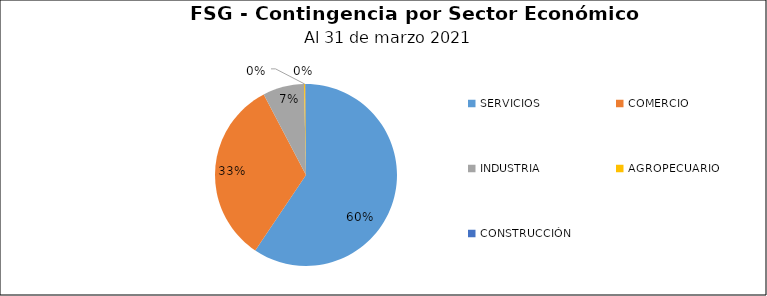
| Category | Saldo | Créditos |
|---|---|---|
| SERVICIOS | 60.328 | 8251 |
| COMERCIO | 33.409 | 10050 |
| INDUSTRIA | 7.45 | 2225 |
| AGROPECUARIO | 0.254 | 36 |
| CONSTRUCCIÓN | 0.099 | 13 |